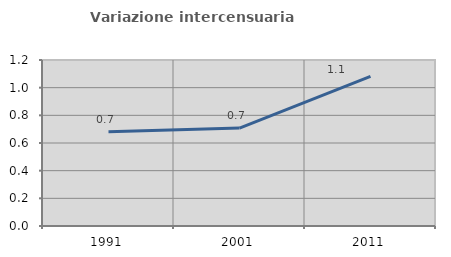
| Category | Variazione intercensuaria annua |
|---|---|
| 1991.0 | 0.681 |
| 2001.0 | 0.708 |
| 2011.0 | 1.082 |